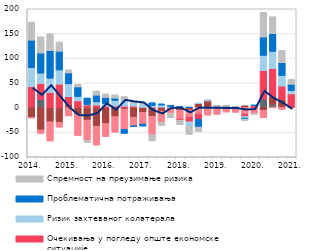
| Category | Други фактори | Трошкови извора за кредите | Конкуренција осталих банака | Очекивања у погледу опште економске ситуације | Ризик захтеваног колатерала | Проблематична потраживања | Спремност на преузимање ризика |
|---|---|---|---|---|---|---|---|
| 2014. | 0.8 | -19.9 | -1.7 | 41 | 39.1 | 55.5 | 36.9 |
|  | 16.1 | -45.3 | -7.7 | 31.9 | 21.4 | 40.8 | 33.2 |
|  | 0 | -29 | -39.1 | 30.4 | 28.9 | 55.7 | 34.4 |
|  | 0 | -30.3 | -9.6 | 47.3 | 28.6 | 38.1 | 18.7 |
| 2015. | 0 | 5.3 | -17.2 | 16.4 | 26.1 | 22.1 | 6.2 |
|  | 0 | -14.5 | -42.3 | 13.3 | 8.7 | 19.6 | 6 |
|  | -0.9 | -24.7 | -41.2 | 5.2 | 0.6 | 13.5 | -4.1 |
|  | 0.5 | -38.1 | -38.3 | 4.2 | 6.5 | 13.7 | 8.7 |
| 2016. | 0 | -32.5 | -26.6 | 2.8 | 4.8 | 12.6 | 7.3 |
|  | 0 | -18.6 | -31.7 | 2.8 | 11.4 | 4.8 | 6.6 |
|  | 0 | -3.2 | -40.9 | 2.6 | 11.7 | -8.5 | 8 |
|  | 0 | -19.7 | -17.5 | 2.6 | 6.4 | -2 | 5.6 |
| 2017. | 0 | -9.9 | -23.6 | 0.3 | 6.6 | -4.3 | 1.9 |
|  | 0 | -17.9 | -37.2 | 0.4 | 3.4 | 5.9 | -12.7 |
|  | 0 | -7.4 | -22.4 | 0.6 | 4.3 | 2.5 | -6.8 |
|  | 0 | -2.2 | -9.3 | 0.1 | 2.2 | 2.2 | -9.5 |
| 2018. | 0 | -5.5 | -17.5 | -2.5 | 0 | 1.9 | -9.6 |
|  | 0 | -5.2 | -14.4 | -9.5 | -9.1 | 0.3 | -16.5 |
|  | 0 | 8.2 | -13.3 | -10.8 | 0.3 | -15.6 | -8.9 |
|  | 0 | 13.5 | -15.5 | 0.1 | 0.3 | 0.3 | 0.1 |
| 2019. | 0 | 0 | -14 | 0.1 | 2.4 | 0.3 | 0.1 |
|  | 0 | 2.3 | -9.4 | 0.1 | 0.3 | 0.3 | 0.1 |
|  | 0 | 0 | -9.9 | 0.1 | 0.4 | 0.4 | 0.1 |
|  | 0 | 3.5 | -13.7 | -4.4 | -3.2 | -2.2 | -3.4 |
| 2020. | 0 | 0 | -11.9 | 3.7 | 0.4 | 0.4 | -2.6 |
|  | 16.6 | -5.6 | -15.1 | 57.7 | 31.2 | 37.3 | 50 |
|  | 6.7 | 15.9 | -0.1 | 55.9 | 35 | 36.1 | 34.5 |
|  | 0 | 16.2 | -4 | 27.2 | 21.1 | 26.4 | 24.9 |
| 2021. | 0 | 0 | -0.2 | 27.5 | 6.7 | 12.9 | 10 |